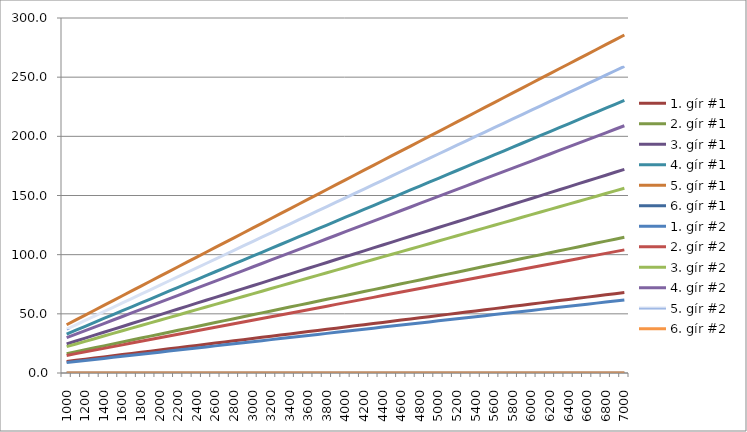
| Category | 1. gír #1 | 2. gír #1 | 3. gír #1 | 4. gír #1 | 5. gír #1 | 6. gír #1 | 1. gír #2 | 2. gír #2 | 3. gír #2 | 4. gír #2 | 5. gír #2 | 6. gír #2 |
|---|---|---|---|---|---|---|---|---|---|---|---|---|
| 1000.0 | 9.716 | 16.388 | 24.582 | 32.908 | 40.806 | 0 | 8.813 | 14.866 | 22.299 | 29.852 | 37.016 | 0 |
| 1100.0 | 10.687 | 18.027 | 27.04 | 36.199 | 44.887 | 0 | 9.695 | 16.353 | 24.529 | 32.837 | 40.718 | 0 |
| 1200.0 | 11.659 | 19.666 | 29.499 | 39.49 | 48.968 | 0 | 10.576 | 17.839 | 26.759 | 35.822 | 44.42 | 0 |
| 1300.0 | 12.631 | 21.305 | 31.957 | 42.781 | 53.048 | 0 | 11.457 | 19.326 | 28.989 | 38.807 | 48.121 | 0 |
| 1400.0 | 13.602 | 22.943 | 34.415 | 46.072 | 57.129 | 0 | 12.339 | 20.812 | 31.219 | 41.793 | 51.823 | 0 |
| 1500.0 | 14.574 | 24.582 | 36.873 | 49.363 | 61.21 | 0 | 13.22 | 22.299 | 33.448 | 44.778 | 55.524 | 0 |
| 1600.0 | 15.545 | 26.221 | 39.331 | 52.653 | 65.29 | 0 | 14.101 | 23.786 | 35.678 | 47.763 | 59.226 | 0 |
| 1700.0 | 16.517 | 27.86 | 41.79 | 55.944 | 69.371 | 0 | 14.983 | 25.272 | 37.908 | 50.748 | 62.928 | 0 |
| 1800.0 | 17.488 | 29.499 | 44.248 | 59.235 | 73.452 | 0 | 15.864 | 26.759 | 40.138 | 53.733 | 66.629 | 0 |
| 1900.0 | 18.46 | 31.137 | 46.706 | 62.526 | 77.532 | 0 | 16.745 | 28.245 | 42.368 | 56.719 | 70.331 | 0 |
| 2000.0 | 19.432 | 32.776 | 49.164 | 65.817 | 81.613 | 0 | 17.627 | 29.732 | 44.598 | 59.704 | 74.033 | 0 |
| 2100.0 | 20.403 | 34.415 | 51.623 | 69.108 | 85.693 | 0 | 18.508 | 31.219 | 46.828 | 62.689 | 77.734 | 0 |
| 2200.0 | 21.375 | 36.054 | 54.081 | 72.398 | 89.774 | 0 | 19.39 | 32.705 | 49.058 | 65.674 | 81.436 | 0 |
| 2300.0 | 22.346 | 37.693 | 56.539 | 75.689 | 93.855 | 0 | 20.271 | 34.192 | 51.288 | 68.659 | 85.138 | 0 |
| 2400.0 | 23.318 | 39.331 | 58.997 | 78.98 | 97.935 | 0 | 21.152 | 35.678 | 53.518 | 71.645 | 88.839 | 0 |
| 2500.0 | 24.29 | 40.97 | 61.455 | 82.271 | 102.016 | 0 | 22.034 | 37.165 | 55.747 | 74.63 | 92.541 | 0 |
| 2600.0 | 25.261 | 42.609 | 63.914 | 85.562 | 106.097 | 0 | 22.915 | 38.652 | 57.977 | 77.615 | 96.242 | 0 |
| 2700.0 | 26.233 | 44.248 | 66.372 | 88.853 | 110.177 | 0 | 23.796 | 40.138 | 60.207 | 80.6 | 99.944 | 0 |
| 2800.0 | 27.204 | 45.887 | 68.83 | 92.143 | 114.258 | 0 | 24.678 | 41.625 | 62.437 | 83.585 | 103.646 | 0 |
| 2900.0 | 28.176 | 47.526 | 71.288 | 95.434 | 118.339 | 0 | 25.559 | 43.111 | 64.667 | 86.57 | 107.347 | 0 |
| 3000.0 | 29.147 | 49.164 | 73.746 | 98.725 | 122.419 | 0 | 26.44 | 44.598 | 66.897 | 89.556 | 111.049 | 0 |
| 3100.0 | 30.119 | 50.803 | 76.205 | 102.016 | 126.5 | 0 | 27.322 | 46.085 | 69.127 | 92.541 | 114.751 | 0 |
| 3200.0 | 31.091 | 52.442 | 78.663 | 105.307 | 130.58 | 0 | 28.203 | 47.571 | 71.357 | 95.526 | 118.452 | 0 |
| 3300.0 | 32.062 | 54.081 | 81.121 | 108.598 | 134.661 | 0 | 29.084 | 49.058 | 73.587 | 98.511 | 122.154 | 0 |
| 3400.0 | 33.034 | 55.72 | 83.579 | 111.888 | 138.742 | 0 | 29.966 | 50.544 | 75.817 | 101.496 | 125.856 | 0 |
| 3500.0 | 34.005 | 57.358 | 86.038 | 115.179 | 142.822 | 0 | 30.847 | 52.031 | 78.046 | 104.482 | 129.557 | 0 |
| 3600.0 | 34.977 | 58.997 | 88.496 | 118.47 | 146.903 | 0 | 31.728 | 53.518 | 80.276 | 107.467 | 133.259 | 0 |
| 3700.0 | 35.948 | 60.636 | 90.954 | 121.761 | 150.984 | 0 | 32.61 | 55.004 | 82.506 | 110.452 | 136.96 | 0 |
| 3800.0 | 36.92 | 62.275 | 93.412 | 125.052 | 155.064 | 0 | 33.491 | 56.491 | 84.736 | 113.437 | 140.662 | 0 |
| 3900.0 | 37.892 | 63.914 | 95.87 | 128.343 | 159.145 | 0 | 34.372 | 57.977 | 86.966 | 116.422 | 144.364 | 0 |
| 4000.0 | 38.863 | 65.552 | 98.329 | 131.634 | 163.226 | 0 | 35.254 | 59.464 | 89.196 | 119.408 | 148.065 | 0 |
| 4100.0 | 39.835 | 67.191 | 100.787 | 134.924 | 167.306 | 0 | 36.135 | 60.951 | 91.426 | 122.393 | 151.767 | 0 |
| 4200.0 | 40.806 | 68.83 | 103.245 | 138.215 | 171.387 | 0 | 37.016 | 62.437 | 93.656 | 125.378 | 155.469 | 0 |
| 4300.0 | 41.778 | 70.469 | 105.703 | 141.506 | 175.467 | 0 | 37.898 | 63.924 | 95.886 | 128.363 | 159.17 | 0 |
| 4400.0 | 42.75 | 72.108 | 108.162 | 144.797 | 179.548 | 0 | 38.779 | 65.41 | 98.116 | 131.348 | 162.872 | 0 |
| 4500.0 | 43.721 | 73.746 | 110.62 | 148.088 | 183.629 | 0 | 39.66 | 66.897 | 100.345 | 134.333 | 166.573 | 0 |
| 4600.0 | 44.693 | 75.385 | 113.078 | 151.379 | 187.709 | 0 | 40.542 | 68.384 | 102.575 | 137.319 | 170.275 | 0 |
| 4700.0 | 45.664 | 77.024 | 115.536 | 154.669 | 191.79 | 0 | 41.423 | 69.87 | 104.805 | 140.304 | 173.977 | 0 |
| 4800.0 | 46.636 | 78.663 | 117.994 | 157.96 | 195.871 | 0 | 42.304 | 71.357 | 107.035 | 143.289 | 177.678 | 0 |
| 4900.0 | 47.607 | 80.302 | 120.453 | 161.251 | 199.951 | 0 | 43.186 | 72.843 | 109.265 | 146.274 | 181.38 | 0 |
| 5000.0 | 48.579 | 81.941 | 122.911 | 164.542 | 204.032 | 0 | 44.067 | 74.33 | 111.495 | 149.259 | 185.082 | 0 |
| 5100.0 | 49.551 | 83.579 | 125.369 | 167.833 | 208.113 | 0 | 44.948 | 75.817 | 113.725 | 152.245 | 188.783 | 0 |
| 5200.0 | 50.522 | 85.218 | 127.827 | 171.124 | 212.193 | 0 | 45.83 | 77.303 | 115.955 | 155.23 | 192.485 | 0 |
| 5300.0 | 51.494 | 86.857 | 130.285 | 174.414 | 216.274 | 0 | 46.711 | 78.79 | 118.185 | 158.215 | 196.187 | 0 |
| 5400.0 | 52.465 | 88.496 | 132.744 | 177.705 | 220.355 | 0 | 47.592 | 80.276 | 120.415 | 161.2 | 199.888 | 0 |
| 5500.0 | 53.437 | 90.135 | 135.202 | 180.996 | 224.435 | 0 | 48.474 | 81.763 | 122.644 | 164.185 | 203.59 | 0 |
| 5600.0 | 54.409 | 91.773 | 137.66 | 184.287 | 228.516 | 0 | 49.355 | 83.25 | 124.874 | 167.171 | 207.291 | 0 |
| 5700.0 | 55.38 | 93.412 | 140.118 | 187.578 | 232.596 | 0 | 50.236 | 84.736 | 127.104 | 170.156 | 210.993 | 0 |
| 5800.0 | 56.352 | 95.051 | 142.577 | 190.869 | 236.677 | 0 | 51.118 | 86.223 | 129.334 | 173.141 | 214.695 | 0 |
| 5900.0 | 57.323 | 96.69 | 145.035 | 194.159 | 240.758 | 0 | 51.999 | 87.709 | 131.564 | 176.126 | 218.396 | 0 |
| 6000.0 | 58.295 | 98.329 | 147.493 | 197.45 | 244.838 | 0 | 52.88 | 89.196 | 133.794 | 179.111 | 222.098 | 0 |
| 6100.0 | 59.266 | 99.967 | 149.951 | 200.741 | 248.919 | 0 | 53.762 | 90.683 | 136.024 | 182.096 | 225.8 | 0 |
| 6200.0 | 60.238 | 101.606 | 152.409 | 204.032 | 253 | 0 | 54.643 | 92.169 | 138.254 | 185.082 | 229.501 | 0 |
| 6300.0 | 61.21 | 103.245 | 154.868 | 207.323 | 257.08 | 0 | 55.524 | 93.656 | 140.484 | 188.067 | 233.203 | 0 |
| 6400.0 | 62.181 | 104.884 | 157.326 | 210.614 | 261.161 | 0 | 56.406 | 95.142 | 142.714 | 191.052 | 236.904 | 0 |
| 6500.0 | 63.153 | 106.523 | 159.784 | 213.904 | 265.242 | 0 | 57.287 | 96.629 | 144.943 | 194.037 | 240.606 | 0 |
| 6600.0 | 64.124 | 108.162 | 162.242 | 217.195 | 269.322 | 0 | 58.169 | 98.116 | 147.173 | 197.022 | 244.308 | 0 |
| 6700.0 | 65.096 | 109.8 | 164.701 | 220.486 | 273.403 | 0 | 59.05 | 99.602 | 149.403 | 200.008 | 248.009 | 0 |
| 6800.0 | 66.067 | 111.439 | 167.159 | 223.777 | 277.483 | 0 | 59.931 | 101.089 | 151.633 | 202.993 | 251.711 | 0 |
| 6900.0 | 67.039 | 113.078 | 169.617 | 227.068 | 281.564 | 0 | 60.813 | 102.575 | 153.863 | 205.978 | 255.413 | 0 |
| 7000.0 | 68.011 | 114.717 | 172.075 | 230.359 | 285.645 | 0 | 61.694 | 104.062 | 156.093 | 208.963 | 259.114 | 0 |